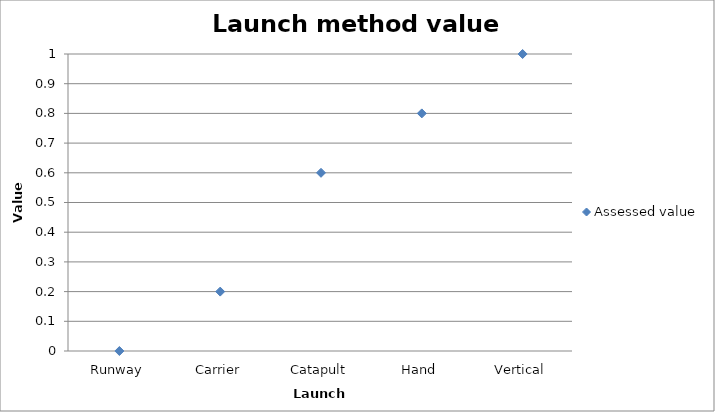
| Category | Assessed value |
|---|---|
| Runway | 0 |
| Carrier | 0.2 |
| Catapult | 0.6 |
| Hand | 0.8 |
| Vertical | 1 |